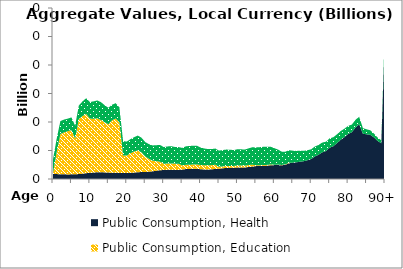
| Category | Public Consumption, Health | Public Consumption, Education | Public Consumption, Other than health and education |
|---|---|---|---|
| 0 | 0.882 | 0.167 | 2.412 |
|  | 0.863 | 3.854 | 2.36 |
| 2 | 0.828 | 7.066 | 2.266 |
| 3 | 0.823 | 7.352 | 2.251 |
| 4 | 0.807 | 7.583 | 2.206 |
| 5 | 0.815 | 7.767 | 2.231 |
| 6 | 0.824 | 6.283 | 2.255 |
| 7 | 0.867 | 9.655 | 2.37 |
| 8 | 0.938 | 10.113 | 2.561 |
| 9 | 1.022 | 10.38 | 2.777 |
| 10 | 1.076 | 9.526 | 2.902 |
| 11 | 1.141 | 9.436 | 3.046 |
| 12 | 1.179 | 9.486 | 3.113 |
| 13 | 1.206 | 9.134 | 3.145 |
| 14 | 1.155 | 8.812 | 2.976 |
| 15 | 1.141 | 8.46 | 2.902 |
| 16 | 1.089 | 9.206 | 2.736 |
| 17 | 1.083 | 9.532 | 2.686 |
| 18 | 1.07 | 8.883 | 2.615 |
| 19 | 1.047 | 3.086 | 2.511 |
| 20 | 1.05 | 3.058 | 2.462 |
| 21 | 1.089 | 3.417 | 2.49 |
| 22 | 1.126 | 3.705 | 2.511 |
| 23 | 1.198 | 3.82 | 2.604 |
| 24 | 1.215 | 3.446 | 2.575 |
| 25 | 1.218 | 2.745 | 2.519 |
| 26 | 1.283 | 2.248 | 2.589 |
| 27 | 1.349 | 1.879 | 2.662 |
| 28 | 1.447 | 1.685 | 2.797 |
| 29 | 1.551 | 1.483 | 2.948 |
| 30 | 1.563 | 1.109 | 2.934 |
| 31 | 1.607 | 1.11 | 2.992 |
| 32 | 1.629 | 1.11 | 3.024 |
| 33 | 1.584 | 1.109 | 2.938 |
| 34 | 1.573 | 1.109 | 2.919 |
| 35 | 1.651 | 0.742 | 3.063 |
| 36 | 1.747 | 0.742 | 3.241 |
| 37 | 1.773 | 0.742 | 3.286 |
| 38 | 1.787 | 0.742 | 3.298 |
| 39 | 1.809 | 0.742 | 3.3 |
| 40 | 1.714 | 0.742 | 3.072 |
| 41 | 1.676 | 0.741 | 2.934 |
| 42 | 1.67 | 0.741 | 2.846 |
| 43 | 1.696 | 0.741 | 2.811 |
| 44 | 1.762 | 0.741 | 2.839 |
| 45 | 1.807 | 0.336 | 2.831 |
| 46 | 1.881 | 0.336 | 2.871 |
| 47 | 1.939 | 0.336 | 2.884 |
| 48 | 1.956 | 0.336 | 2.845 |
| 49 | 1.954 | 0.336 | 2.788 |
| 50 | 2.03 | 0.336 | 2.856 |
| 51 | 2.034 | 0.336 | 2.837 |
| 52 | 2.022 | 0.336 | 2.811 |
| 53 | 2.108 | 0.337 | 2.929 |
| 54 | 2.186 | 0.337 | 3.036 |
| 55 | 2.259 | 0.141 | 3.138 |
| 56 | 2.278 | 0.141 | 3.164 |
| 57 | 2.311 | 0.141 | 3.197 |
| 58 | 2.338 | 0.141 | 3.162 |
| 59 | 2.414 | 0.141 | 3.103 |
| 60 | 2.437 | 0.077 | 2.896 |
| 61 | 2.447 | 0.077 | 2.642 |
| 62 | 2.392 | 0.076 | 2.333 |
| 63 | 2.509 | 0.076 | 2.214 |
| 64 | 2.758 | 0.076 | 2.217 |
| 65 | 2.862 | 0 | 2.112 |
| 66 | 2.928 | 0 | 1.997 |
| 67 | 3.041 | 0 | 1.925 |
| 68 | 3.124 | 0 | 1.825 |
| 69 | 3.296 | 0 | 1.76 |
| 70 | 3.514 | 0 | 1.705 |
| 71 | 3.959 | 0 | 1.747 |
| 72 | 4.261 | 0 | 1.716 |
| 73 | 4.68 | 0 | 1.717 |
| 74 | 4.906 | 0 | 1.632 |
| 75 | 5.487 | 0 | 1.648 |
| 76 | 5.763 | 0 | 1.564 |
| 77 | 6.298 | 0 | 1.548 |
| 78 | 6.887 | 0 | 1.529 |
| 79 | 7.35 | 0 | 1.471 |
| 80 | 7.893 | 0 | 1.424 |
| 81 | 8.199 | 0 | 1.34 |
| 82 | 9.039 | 0 | 1.346 |
| 83 | 9.612 | 0 | 1.305 |
| 84 | 7.954 | 0 | 0.983 |
| 85 | 7.842 | 0 | 0.882 |
| 86 | 7.752 | 0 | 0.795 |
| 87 | 7.305 | 0 | 0.688 |
| 88 | 6.679 | 0 | 0.582 |
| 89 | 6.269 | 0 | 0.511 |
| 90+ | 25.461 | 0 | 1.714 |